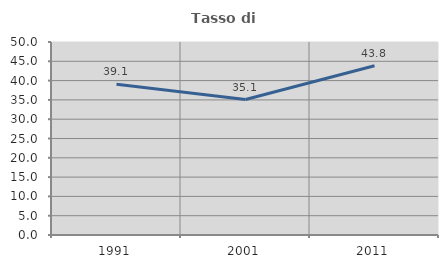
| Category | Tasso di occupazione   |
|---|---|
| 1991.0 | 39.052 |
| 2001.0 | 35.096 |
| 2011.0 | 43.83 |